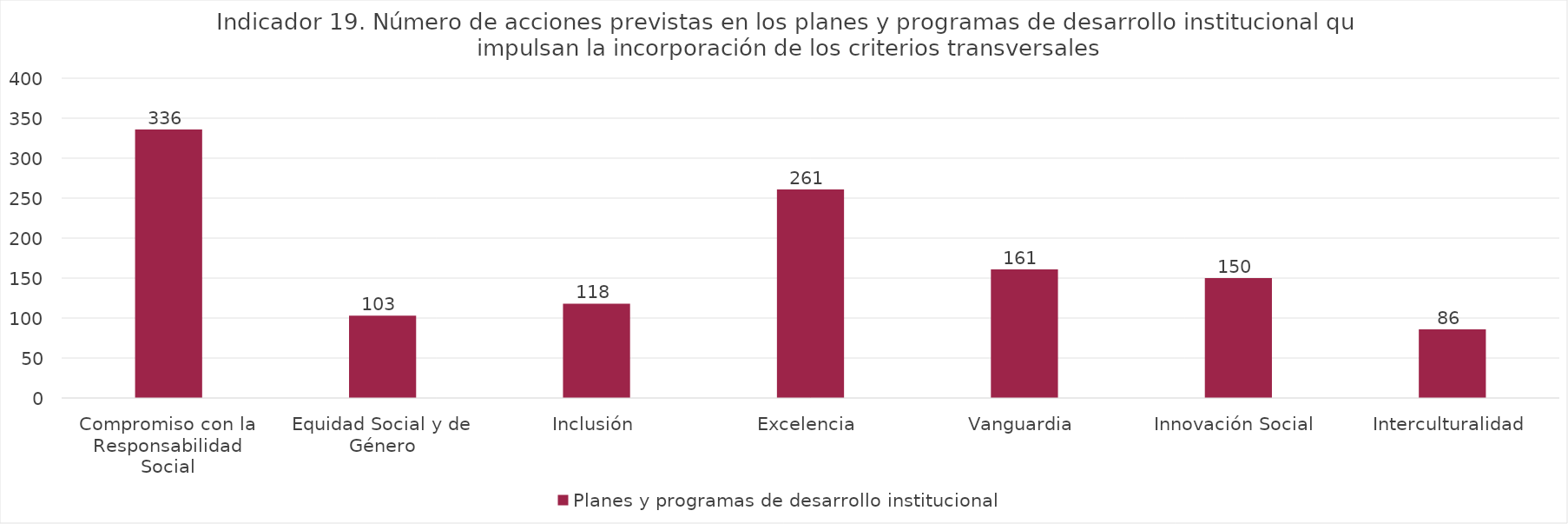
| Category | Planes y programas de desarrollo institucional |
|---|---|
| Compromiso con la Responsabilidad Social | 336 |
| Equidad Social y de Género | 103 |
| Inclusión | 118 |
| Excelencia | 261 |
| Vanguardia | 161 |
| Innovación Social | 150 |
| Interculturalidad | 86 |